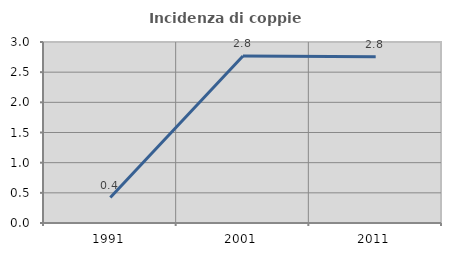
| Category | Incidenza di coppie miste |
|---|---|
| 1991.0 | 0.422 |
| 2001.0 | 2.767 |
| 2011.0 | 2.756 |